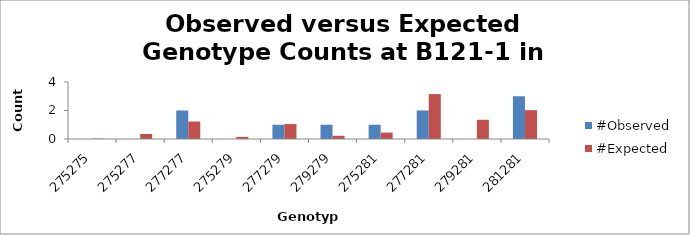
| Category | #Observed | #Expected |
|---|---|---|
| 275275.0 | 0 | 0.025 |
| 275277.0 | 0 | 0.35 |
| 277277.0 | 2 | 1.225 |
| 275279.0 | 0 | 0.15 |
| 277279.0 | 1 | 1.05 |
| 279279.0 | 1 | 0.225 |
| 275281.0 | 1 | 0.45 |
| 277281.0 | 2 | 3.15 |
| 279281.0 | 0 | 1.35 |
| 281281.0 | 3 | 2.025 |